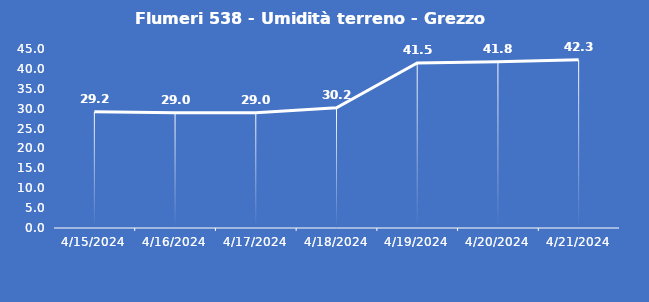
| Category | Flumeri 538 - Umidità terreno - Grezzo (%VWC) |
|---|---|
| 4/15/24 | 29.2 |
| 4/16/24 | 29 |
| 4/17/24 | 29 |
| 4/18/24 | 30.2 |
| 4/19/24 | 41.5 |
| 4/20/24 | 41.8 |
| 4/21/24 | 42.3 |